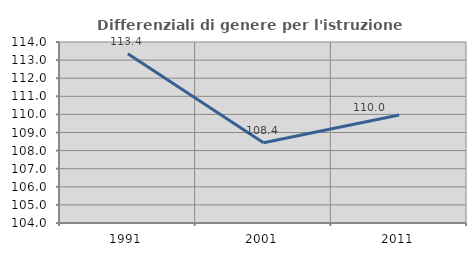
| Category | Differenziali di genere per l'istruzione superiore |
|---|---|
| 1991.0 | 113.353 |
| 2001.0 | 108.429 |
| 2011.0 | 109.969 |